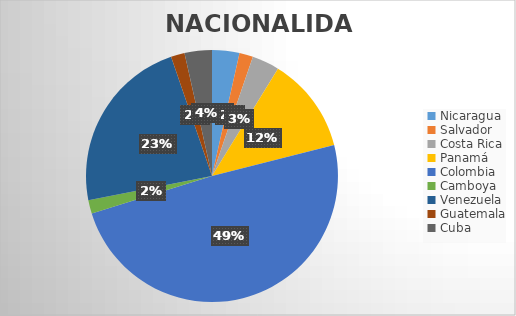
| Category | Series 0 |
|---|---|
| Nicaragua  | 2 |
| Salvador | 1 |
| Costa Rica | 2 |
| Panamá  | 7 |
| Colombia | 28 |
| Camboya  | 1 |
| Venezuela | 13 |
| Guatemala | 1 |
| Cuba | 2 |